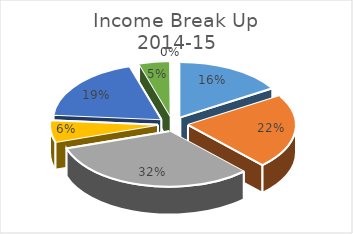
| Category | Income Break Up 
2014-15 |
|---|---|
| FCO Grant | 0.162 |
| Teaching | 0.217 |
| Examination | 0.321 |
| Partnership | 0.063 |
| Contracts | 0.189 |
| Other Paid Services | 0.046 |
| Bank Interest | 0.001 |